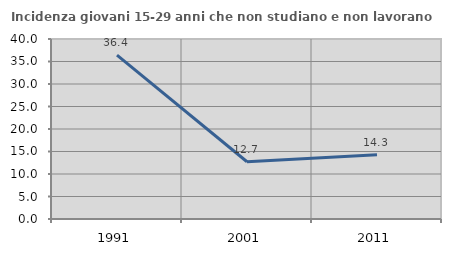
| Category | Incidenza giovani 15-29 anni che non studiano e non lavorano  |
|---|---|
| 1991.0 | 36.427 |
| 2001.0 | 12.727 |
| 2011.0 | 14.286 |